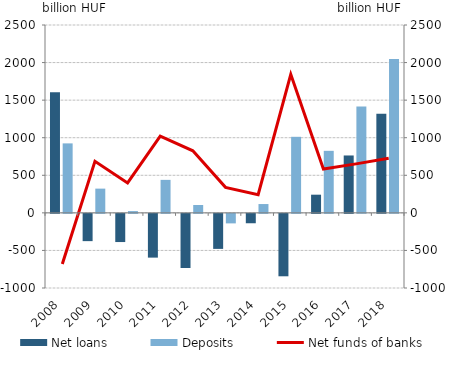
| Category | Net loans | Deposits |
|---|---|---|
| 2008.0 | 1604.117 | 924.526 |
| 2009.0 | -363.024 | 322.449 |
| 2010.0 | -375.15 | 23.517 |
| 2011.0 | -582.414 | 439.017 |
| 2012.0 | -720.502 | 104.961 |
| 2013.0 | -466.305 | -126.817 |
| 2014.0 | -125.073 | 117.279 |
| 2015.0 | -830.803 | 1012.037 |
| 2016.0 | 241.811 | 825.492 |
| 2017.0 | 763.636 | 1415.416 |
| 2018.0 | 1320.037 | 2047.136 |